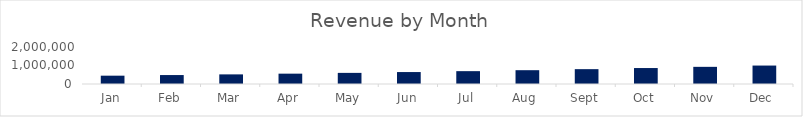
| Category | Revenue by Month |
|---|---|
| 2023-01-01 | 450000 |
| 2023-02-01 | 483750 |
| 2023-03-01 | 520031.25 |
| 2023-04-01 | 559033.594 |
| 2023-05-01 | 600961.113 |
| 2023-06-01 | 646033.197 |
| 2023-07-01 | 694485.687 |
| 2023-08-01 | 746572.113 |
| 2023-09-01 | 802565.022 |
| 2023-10-01 | 862757.398 |
| 2023-11-01 | 927464.203 |
| 2023-12-01 | 997024.018 |